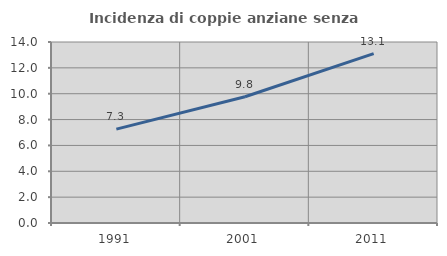
| Category | Incidenza di coppie anziane senza figli  |
|---|---|
| 1991.0 | 7.26 |
| 2001.0 | 9.764 |
| 2011.0 | 13.1 |